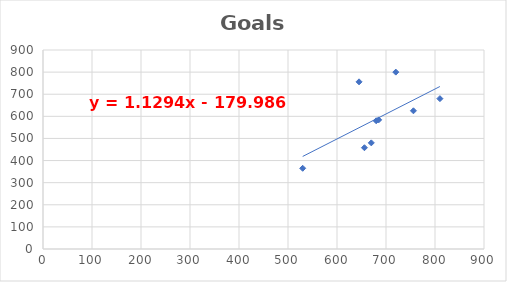
| Category | Goals |
|---|---|
| 720.0 | 800 |
| 645.0 | 756 |
| 656.0 | 458 |
| 756.0 | 625 |
| 680.0 | 580 |
| 810.0 | 680 |
| 670.0 | 480 |
| 530.0 | 365 |
| 685.0 | 584 |